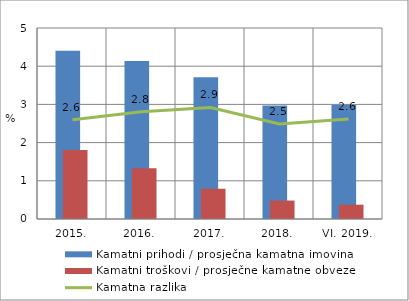
| Category | Kamatni prihodi / prosječna kamatna imovina | Kamatni troškovi / prosječne kamatne obveze |
|---|---|---|
| 2015. | 4.401 | 1.804 |
| 2016. | 4.136 | 1.33 |
| 2017. | 3.712 | 0.792 |
| 2018. | 2.973 | 0.483 |
| VI. 2019. | 2.99 | 0.374 |